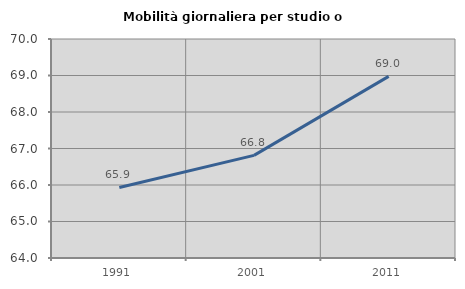
| Category | Mobilità giornaliera per studio o lavoro |
|---|---|
| 1991.0 | 65.934 |
| 2001.0 | 66.813 |
| 2011.0 | 68.975 |